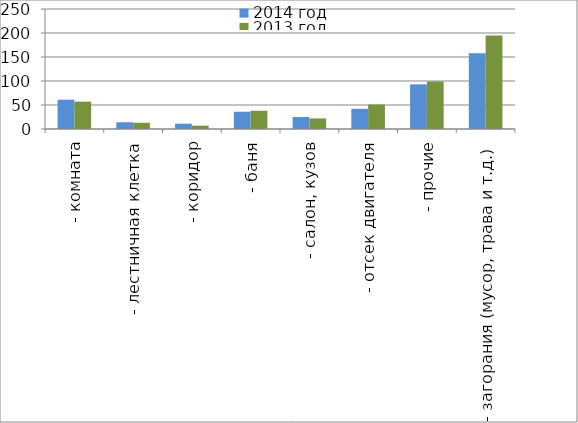
| Category | 2014 год | 2013 год |
|---|---|---|
|  - комната | 61 | 57 |
|  - лестничная клетка | 14 | 13 |
|  - коридор | 11 | 7 |
|  - баня | 36 | 38 |
|  - салон, кузов | 25 | 22 |
|  - отсек двигателя | 42 | 51 |
| - прочие | 93 | 99 |
| - загорания (мусор, трава и т.д.)  | 158 | 195 |